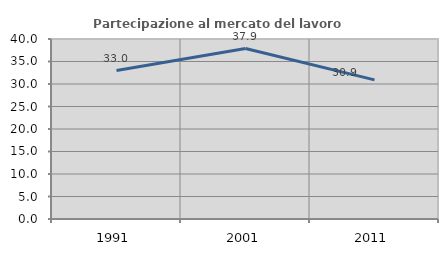
| Category | Partecipazione al mercato del lavoro  femminile |
|---|---|
| 1991.0 | 32.979 |
| 2001.0 | 37.879 |
| 2011.0 | 30.909 |